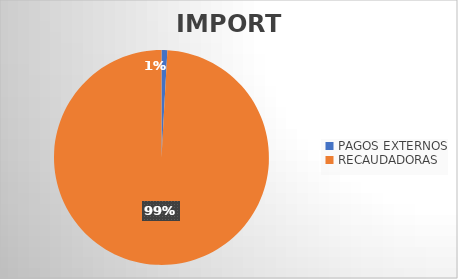
| Category | IMPORTE |
|---|---|
| PAGOS EXTERNOS | 2140261.06 |
| RECAUDADORAS | 242567336.54 |